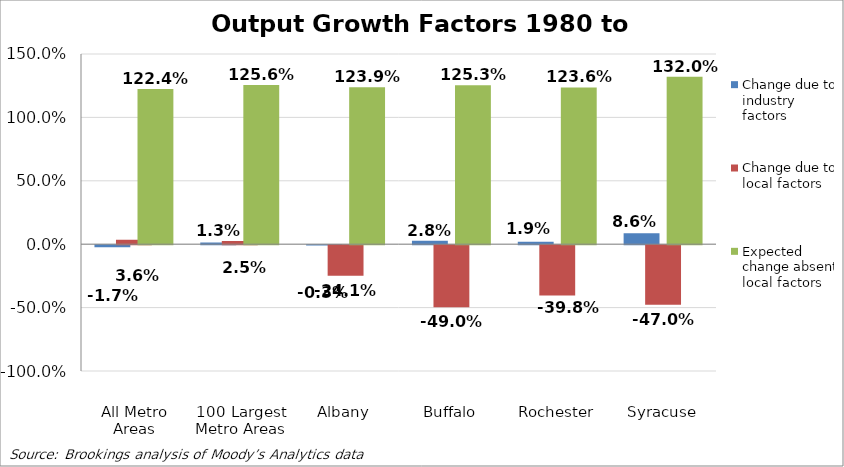
| Category | Change due to industry factors | Change due to local factors | Expected change absent local factors |
|---|---|---|---|
| All Metro Areas | -0.017 | 0.036 | 1.224 |
| 100 Largest Metro Areas | 0.013 | 0.025 | 1.256 |
| Albany | -0.003 | -0.241 | 1.239 |
| Buffalo | 0.028 | -0.49 | 1.253 |
| Rochester | 0.019 | -0.398 | 1.236 |
| Syracuse | 0.086 | -0.47 | 1.32 |